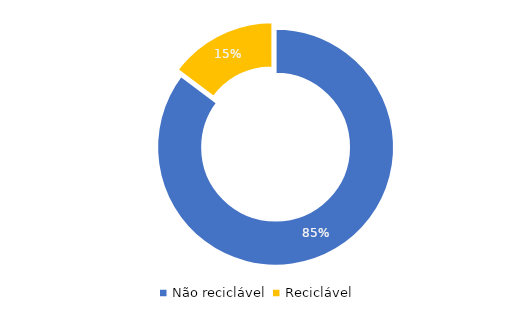
| Category | Series 0 |
|---|---|
| Não reciclável  | 236.45 |
| Reciclável | 40.9 |